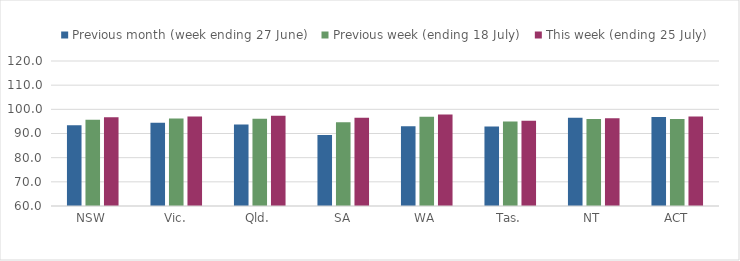
| Category | Previous month (week ending 27 June) | Previous week (ending 18 July) | This week (ending 25 July) |
|---|---|---|---|
| NSW | 93.42 | 95.723 | 96.698 |
| Vic. | 94.445 | 96.159 | 97.025 |
| Qld. | 93.726 | 96.086 | 97.373 |
| SA | 89.418 | 94.676 | 96.503 |
| WA | 93.018 | 96.93 | 97.819 |
| Tas. | 92.915 | 94.932 | 95.241 |
| NT | 96.553 | 95.979 | 96.321 |
| ACT | 96.826 | 95.989 | 97.019 |